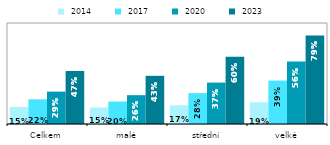
| Category |  2014 |  2017 |  2020 |  2023 |
|---|---|---|---|---|
| Celkem | 0.152 | 0.22 | 0.288 | 0.471 |
| malé | 0.147 | 0.2 | 0.257 | 0.429 |
| střední | 0.166 | 0.275 | 0.369 | 0.6 |
| velké | 0.194 | 0.387 | 0.557 | 0.789 |